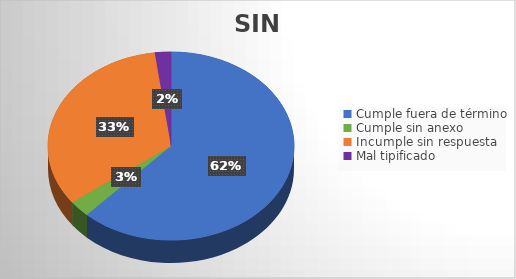
| Category | TOTAL |
|---|---|
| Cumple fuera de término | 88 |
| Cumple sin anexo | 4 |
| Incumple sin respuesta | 47 |
| Mal tipificado | 3 |